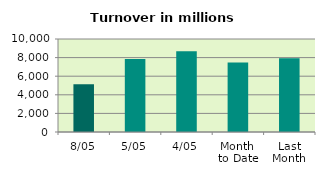
| Category | Series 0 |
|---|---|
| 8/05 | 5143.543 |
| 5/05 | 7844.807 |
| 4/05 | 8689.254 |
| Month 
to Date | 7467.241 |
| Last
Month | 7939.051 |